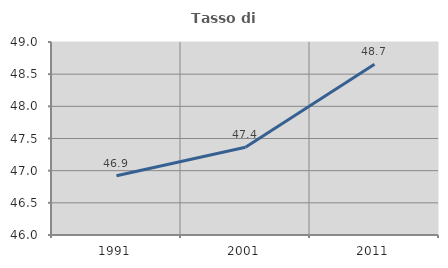
| Category | Tasso di occupazione   |
|---|---|
| 1991.0 | 46.922 |
| 2001.0 | 47.364 |
| 2011.0 | 48.655 |